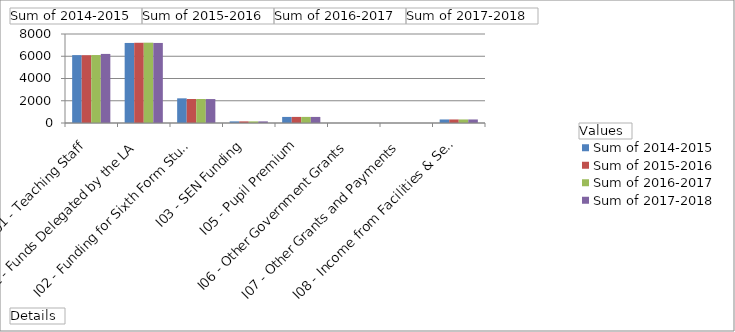
| Category | Sum of 2014-2015 | Sum of 2015-2016 | Sum of 2016-2017 | Sum of 2017-2018 |
|---|---|---|---|---|
| E01 - Teaching Staff | 6101.849 | 6095.253 | 6108.547 | 6209.685 |
| I01 - Funds Delegated by the LA | 7195.151 | 7211.411 | 7219.569 | 7195.151 |
| I02 - Funding for Sixth Form Students | 2217.135 | 2157.051 | 2159.491 | 2152.187 |
| I03 - SEN Funding | 144.989 | 145.316 | 145.481 | 144.989 |
| I05 - Pupil Premium | 546.254 | 547.488 | 548.107 | 546.254 |
| I06 - Other Government Grants | 0 | 0 | 0 | 0 |
| I07 - Other Grants and Payments | 0 | 0 | 0 | 0 |
| I08 - Income from Facilities & Services | 316.943 | 317.659 | 318.018 | 316.943 |